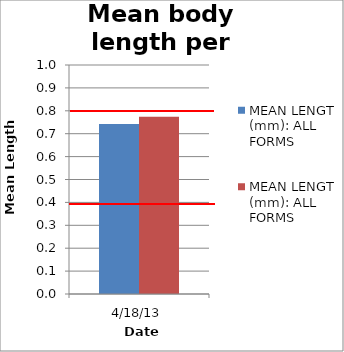
| Category | MEAN LENGTH (mm): ALL FORMS |
|---|---|
| 4/18/13 | 0.774 |